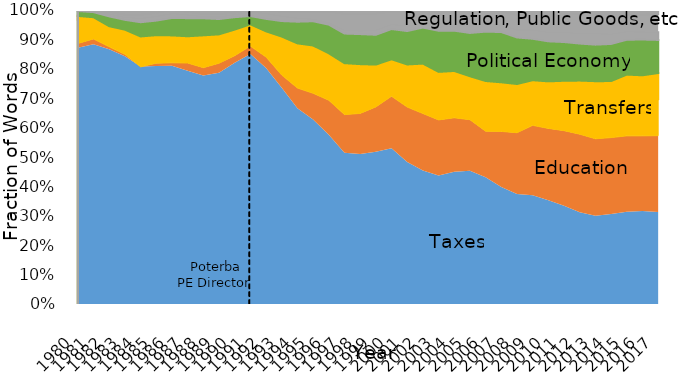
| Category | Tax | Education | Transfers | Social Insurance | Political Economy | Public Goods | Regulation | Other |
|---|---|---|---|---|---|---|---|---|
| 1980.0 | 0.871 | 0.015 |  | 0.013 | 0.017 | 0.001 | 0.003 | 0 |
| 1981.0 | 0.883 | 0.018 |  | 0.012 | 0.017 | 0.004 | 0.003 | 0 |
| 1982.0 | 0.867 | 0.008 |  | 0.019 | 0.033 | 0.009 | 0.006 | 0.006 |
| 1983.0 | 0.843 | 0.006 |  | 0.017 | 0.033 | 0.01 | 0.007 | 0.016 |
| 1984.0 | 0.808 | -0.001 |  | 0.019 | 0.048 | 0.014 | 0.011 | 0.016 |
| 1985.0 | 0.809 | 0.01 |  | 0.012 | 0.05 | 0.015 | 0.011 | 0.01 |
| 1986.0 | 0.81 | 0.01 |  | 0.011 | 0.059 | 0.017 | 0.01 | 0 |
| 1987.0 | 0.794 | 0.026 |  | 0.013 | 0.062 | 0.013 | 0.009 | 0.006 |
| 1988.0 | 0.777 | 0.026 |  | 0.007 | 0.058 | 0.007 | 0.007 | 0.014 |
| 1989.0 | 0.787 | 0.032 |  | 0.006 | 0.052 | 0.008 | 0.008 | 0.014 |
| 1990.0 | 0.821 | 0.024 |  | 0.008 | 0.042 | 0.01 | 0.006 | 0.009 |
| 1991.0 | 0.85 | 0.027 |  | 0.014 | 0.028 | 0.015 | 0.006 | 0 |
| 1992.0 | 0.803 | 0.037 |  | 0.035 | 0.042 | 0.02 | 0.01 | 0 |
| 1993.0 | 0.735 | 0.043 |  | 0.068 | 0.053 | 0.018 | 0.014 | 0.006 |
| 1994.0 | 0.666 | 0.068 |  | 0.083 | 0.074 | 0.013 | 0.02 | 0.006 |
| 1995.0 | 0.628 | 0.089 |  | 0.075 | 0.082 | 0.009 | 0.023 | 0.006 |
| 1996.0 | 0.576 | 0.117 |  | 0.06 | 0.098 | 0.008 | 0.037 | 0.004 |
| 1997.0 | 0.514 | 0.13 |  | 0.063 | 0.101 | 0.013 | 0.054 | 0.013 |
| 1998.0 | 0.51 | 0.138 |  | 0.059 | 0.102 | 0.012 | 0.056 | 0.013 |
| 1999.0 | 0.518 | 0.152 |  | 0.045 | 0.102 | 0.017 | 0.055 | 0.012 |
| 2000.0 | 0.53 | 0.177 |  | 0.031 | 0.103 | 0.017 | 0.043 | 0.005 |
| 2001.0 | 0.483 | 0.187 |  | 0.034 | 0.114 | 0.019 | 0.045 | 0.007 |
| 2002.0 | 0.454 | 0.194 |  | 0.047 | 0.123 | 0.013 | 0.042 | 0.005 |
| 2003.0 | 0.437 | 0.189 |  | 0.052 | 0.14 | 0.014 | 0.048 | 0.008 |
| 2004.0 | 0.45 | 0.184 |  | 0.059 | 0.137 | 0.019 | 0.046 | 0.006 |
| 2005.0 | 0.453 | 0.173 |  | 0.057 | 0.147 | 0.026 | 0.045 | 0.008 |
| 2006.0 | 0.431 | 0.157 |  | 0.064 | 0.168 | 0.027 | 0.045 | 0.002 |
| 2007.0 | 0.398 | 0.189 |  | 0.057 | 0.171 | 0.024 | 0.047 | 0.004 |
| 2008.0 | 0.374 | 0.208 |  | 0.054 | 0.158 | 0.027 | 0.049 | 0.017 |
| 2009.0 | 0.37 | 0.238 |  | 0.046 | 0.141 | 0.031 | 0.045 | 0.022 |
| 2010.0 | 0.353 | 0.244 |  | 0.052 | 0.136 | 0.032 | 0.053 | 0.022 |
| 2011.0 | 0.334 | 0.256 |  | 0.059 | 0.132 | 0.035 | 0.062 | 0.012 |
| 2012.0 | 0.312 | 0.265 |  | 0.073 | 0.126 | 0.035 | 0.064 | 0.015 |
| 2013.0 | 0.3 | 0.262 |  | 0.087 | 0.124 | 0.039 | 0.063 | 0.016 |
| 2014.0 | 0.306 | 0.26 |  | 0.092 | 0.126 | 0.035 | 0.061 | 0.02 |
| 2015.0 | 0.314 | 0.258 |  | 0.094 | 0.119 | 0.029 | 0.056 | 0.016 |
| 2016.0 | 0.316 | 0.256 |  | 0.091 | 0.122 | 0.027 | 0.057 | 0.017 |
| 2017.0 | 0.313 | 0.259 |  | 0.089 | 0.113 | 0.026 | 0.061 | 0.015 |